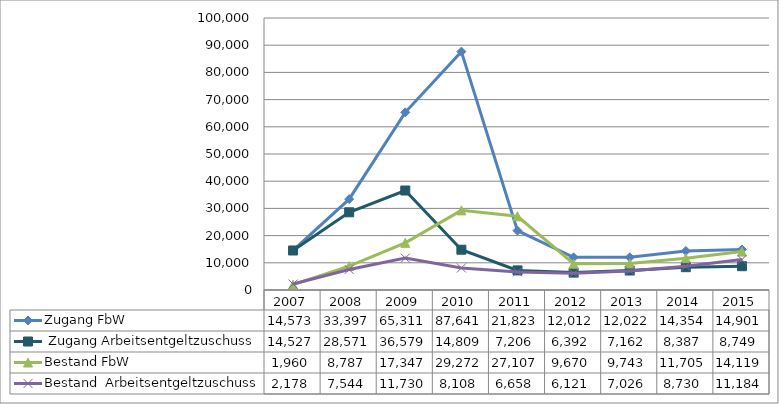
| Category | Zugang FbW |  Zugang Arbeitsentgeltzuschuss | Bestand FbW | Bestand  Arbeitsentgeltzuschuss |
|---|---|---|---|---|
| 2007.0 | 14573 | 14527 | 1960 | 2178 |
| 2008.0 | 33397 | 28571 | 8787 | 7544 |
| 2009.0 | 65311 | 36579 | 17347 | 11730 |
| 2010.0 | 87641 | 14809 | 29272 | 8108 |
| 2011.0 | 21823 | 7206 | 27107 | 6658 |
| 2012.0 | 12012 | 6392 | 9670 | 6121 |
| 2013.0 | 12022 | 7162 | 9743 | 7026 |
| 2014.0 | 14354 | 8387 | 11705 | 8730 |
| 2015.0 | 14901 | 8749 | 14119 | 11184 |